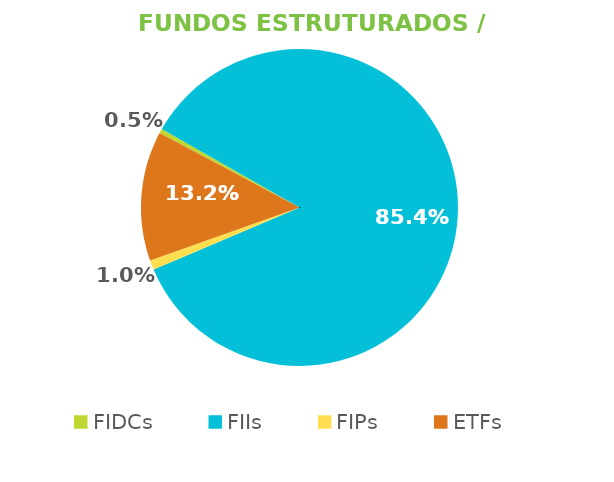
| Category | Fundos Estruturados / ETFs |
|---|---|
| FIDCs | 0.005 |
| FIIs | 0.854 |
| FIPs | 0.01 |
| ETFs | 0.132 |